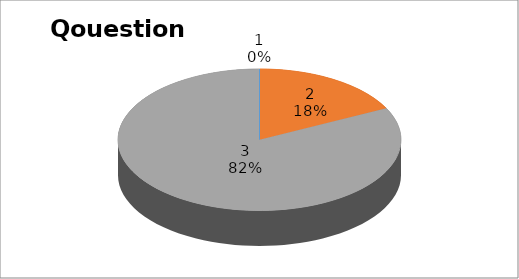
| Category | Series 0 |
|---|---|
| 0 | 0 |
| 1 | 3 |
| 2 | 14 |